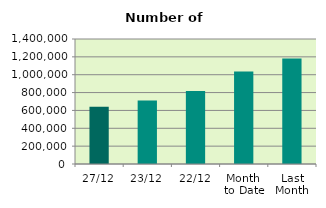
| Category | Series 0 |
|---|---|
| 27/12 | 641050 |
| 23/12 | 712552 |
| 22/12 | 817220 |
| Month 
to Date | 1035166.778 |
| Last
Month | 1182027.273 |